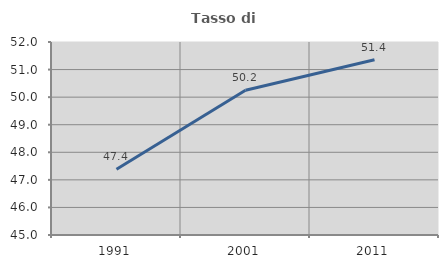
| Category | Tasso di occupazione   |
|---|---|
| 1991.0 | 47.384 |
| 2001.0 | 50.249 |
| 2011.0 | 51.356 |